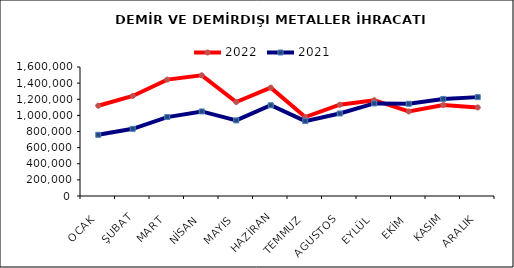
| Category | 2022 | 2021 |
|---|---|---|
| OCAK | 1119859.077 | 758964.79 |
| ŞUBAT | 1241138.758 | 833117.679 |
| MART | 1443516.664 | 978890.1 |
| NİSAN | 1497016.395 | 1048964.829 |
| MAYIS | 1165903.004 | 937477.04 |
| HAZİRAN | 1343748.762 | 1125693.955 |
| TEMMUZ | 978658.197 | 929062.491 |
| AGUSTOS | 1132052.516 | 1023453.584 |
| EYLÜL | 1187991.686 | 1148069.611 |
| EKİM | 1048514.276 | 1144153.347 |
| KASIM | 1128907.847 | 1203737.427 |
| ARALIK | 1098125.651 | 1226342.362 |